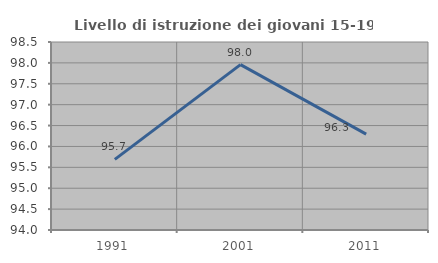
| Category | Livello di istruzione dei giovani 15-19 anni |
|---|---|
| 1991.0 | 95.69 |
| 2001.0 | 97.959 |
| 2011.0 | 96.296 |